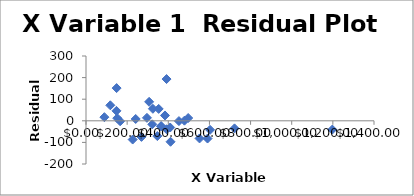
| Category | Series 0 |
|---|---|
| 118.12433333333333 | 71.768 |
| 391.6019999999999 | 193.29 |
| 148.811 | 151.424 |
| 306.95200000000006 | 87.781 |
| 148.0103333333333 | 46.076 |
| 166.0943333333333 | -2.222 |
| 151.89899999999994 | 12.133 |
| 478.4580952380952 | 0.576 |
| 89.37066666666666 | 16.841 |
| 241.57799999999997 | 8.472 |
| 409.27766666666673 | -31.038 |
| 365.05529411764707 | -25.052 |
| 722.015 | -35.014 |
| 391.65000000000003 | -39.146 |
| 1197.3266666666666 | -40.53 |
| 603.088 | -41.793 |
| 410.988 | -97.115 |
| 346.8 | -70.785 |
| 590.7871428571428 | -82.113 |
| 551.95 | -81.688 |
| 496.82 | 12.912 |
| 325.196 | 55.696 |
| 383.98333333333335 | 24.713 |
| 353.33399999999995 | 55.036 |
| 322.1766666666667 | -16.39 |
| 451.65333333333336 | -1.352 |
| 365.21 | -24.934 |
| 296.1983333333333 | 13.737 |
| 269.7033333333333 | -74.519 |
| 226.87875000000003 | -86.761 |